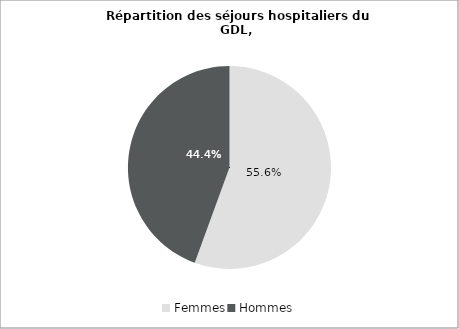
| Category | Series 0 |
|---|---|
| Femmes | 0.556 |
| Hommes | 0.444 |